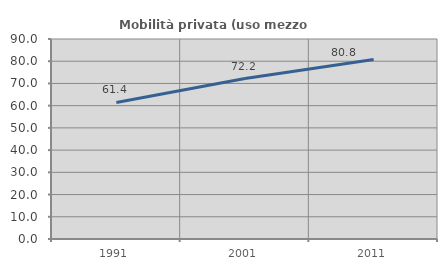
| Category | Mobilità privata (uso mezzo privato) |
|---|---|
| 1991.0 | 61.441 |
| 2001.0 | 72.205 |
| 2011.0 | 80.794 |